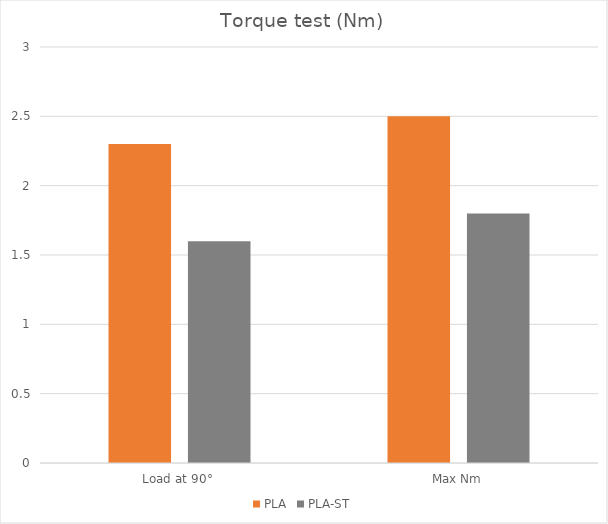
| Category | PLA | PLA-ST |
|---|---|---|
| Load at 90° | 2.3 | 1.6 |
| Max Nm | 2.5 | 1.8 |